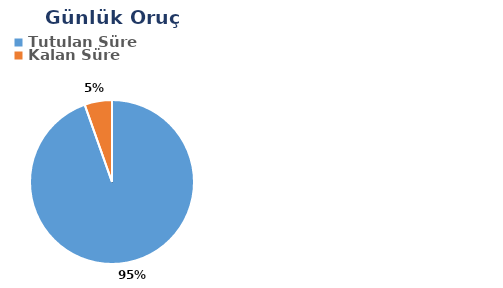
| Category | Günlük |
|---|---|
| Tutulan Süre | 0.552 |
| Kalan Süre | 0.032 |